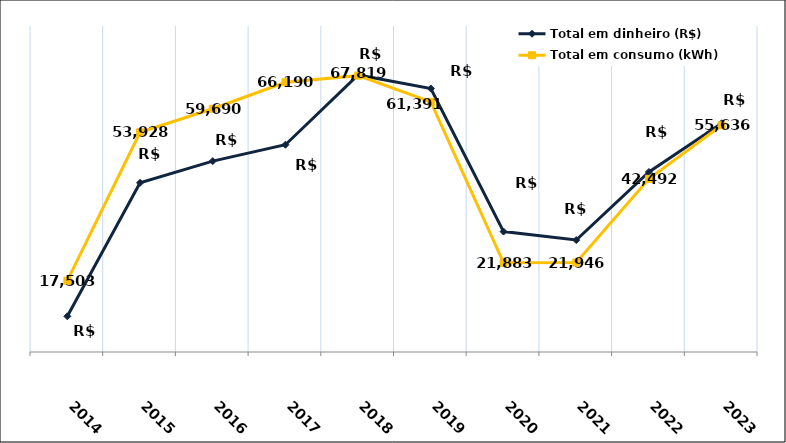
| Category | Total em dinheiro (R$) | Total em consumo (kWh) |
|---|---|---|
| 2014.0 | 8761.95 | 17503 |
| 2015.0 | 41525.31 | 53928 |
| 2016.0 | 46847.92 | 59690 |
| 2017.0 | 50865.42 | 66190 |
| 2018.0 | 67994.74 | 67819 |
| 2019.0 | 64653.54 | 61391 |
| 2020.0 | 29556.66 | 21883 |
| 2021.0 | 27471.43 | 21946 |
| 2022.0 | 44166.93 | 42492 |
| 2023.0 | 56117.91 | 55636 |